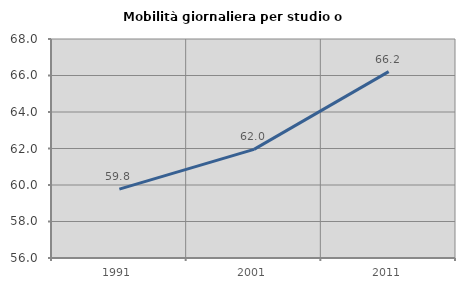
| Category | Mobilità giornaliera per studio o lavoro |
|---|---|
| 1991.0 | 59.772 |
| 2001.0 | 61.953 |
| 2011.0 | 66.212 |